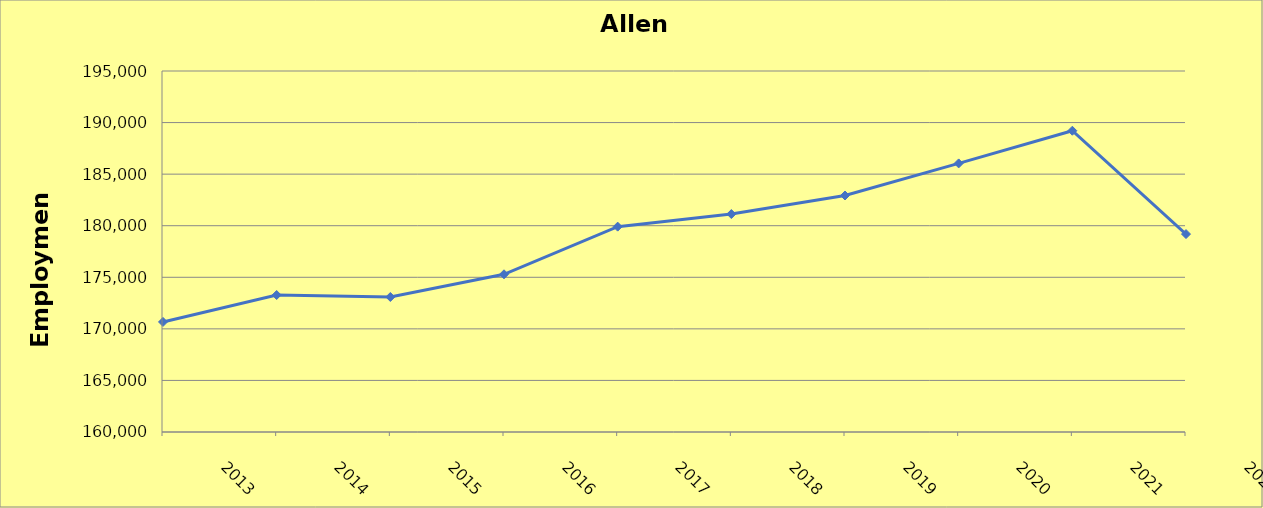
| Category | Allen County |
|---|---|
| 2013.0 | 170670 |
| 2014.0 | 173280 |
| 2015.0 | 173090 |
| 2016.0 | 175290 |
| 2017.0 | 179910 |
| 2018.0 | 181130 |
| 2019.0 | 182930 |
| 2020.0 | 186040 |
| 2021.0 | 189210 |
| 2022.0 | 179190 |